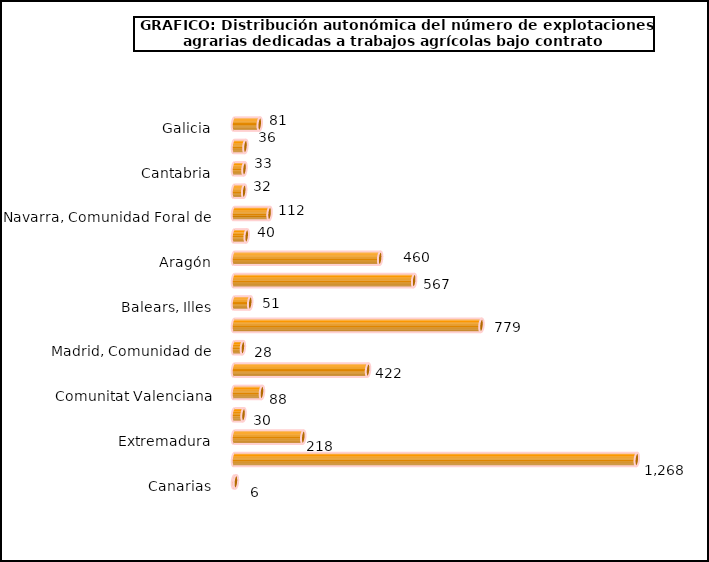
| Category | num. Explotaciones |
|---|---|
| Galicia | 81 |
| Asturias, Principado de | 36 |
| Cantabria | 33 |
| País Vasco | 32 |
| Navarra, Comunidad Foral de | 112 |
| Rioja, La | 40 |
| Aragón | 460 |
| Cataluña | 567 |
| Balears, Illes | 51 |
| Castilla y León | 779 |
| Madrid, Comunidad de | 28 |
| Castilla - La Mancha | 422 |
| Comunitat Valenciana | 88 |
| Murcia, Región de | 30 |
| Extremadura | 218 |
| Andalucía | 1268 |
| Canarias | 6 |